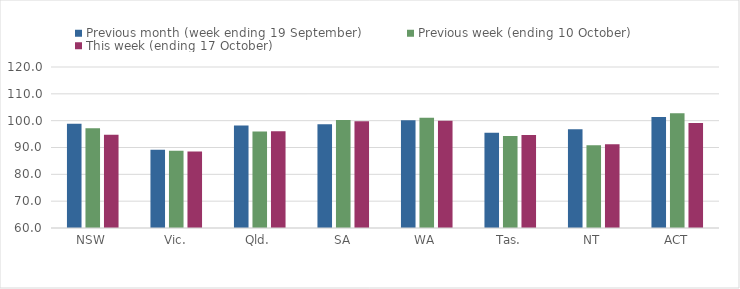
| Category | Previous month (week ending 19 September) | Previous week (ending 10 October) | This week (ending 17 October) |
|---|---|---|---|
| NSW | 98.81 | 97.17 | 94.74 |
| Vic. | 89.15 | 88.82 | 88.48 |
| Qld. | 98.17 | 96 | 96.04 |
| SA | 98.67 | 100.28 | 99.79 |
| WA | 100.15 | 101.07 | 99.96 |
| Tas. | 95.5 | 94.27 | 94.63 |
| NT | 96.81 | 90.8 | 91.24 |
| ACT | 101.37 | 102.74 | 99.12 |